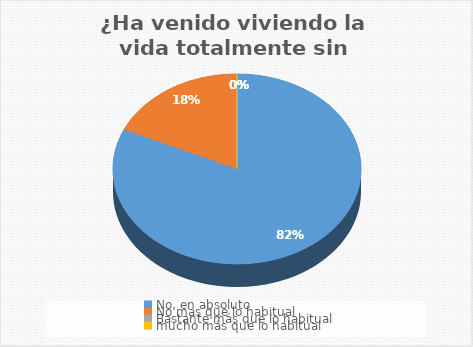
| Category | ¿Ha venido viviendo la vida totalmente sin esperanza? |
|---|---|
| No, en absoluto  | 90 |
| No mas que lo habitual | 20 |
| Bastante más que lo habitual | 0 |
| mucho más que lo habitual | 0 |